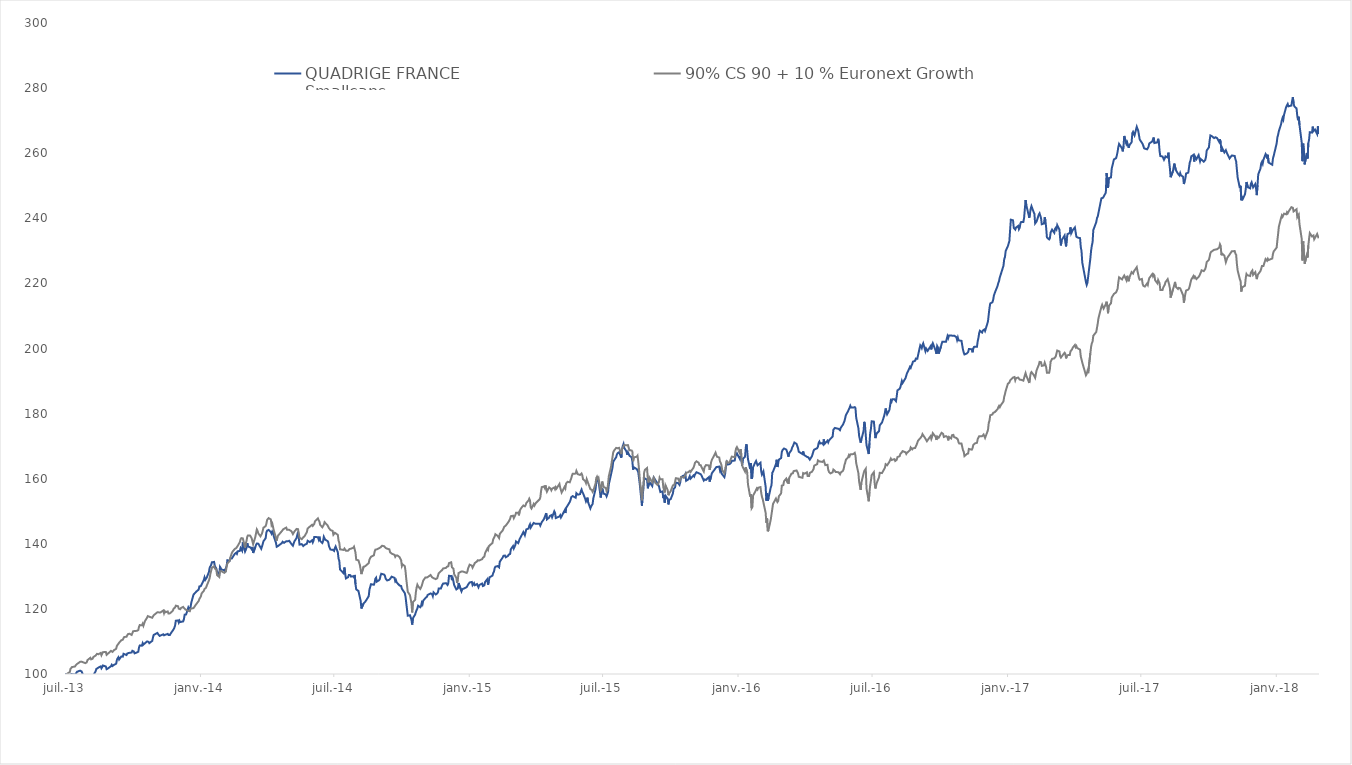
| Category |  QUADRIGE FRANCE
Smallcaps  |  90% CS 90 + 10 % Euronext Growth  |
|---|---|---|
| 2013-07-02 | 100 | 100 |
| 2013-07-03 | 100 | 99.55 |
| 2013-07-04 | 100 | 100 |
| 2013-07-05 | 100 | 100.09 |
| 2013-07-08 | 99.67 | 100.6 |
| 2013-07-09 | 99.74 | 101.59 |
| 2013-07-10 | 99.98 | 101.79 |
| 2013-07-11 | 100.09 | 102.13 |
| 2013-07-12 | 99.94 | 102.13 |
| 2013-07-15 | 99.78 | 102.3 |
| 2013-07-16 | 100.08 | 102.64 |
| 2013-07-17 | 100.35 | 102.73 |
| 2013-07-18 | 100.7 | 103.1 |
| 2013-07-19 | 100.81 | 103.21 |
| 2013-07-22 | 101.04 | 103.74 |
| 2013-07-23 | 101.19 | 103.82 |
| 2013-07-24 | 100.8 | 103.8 |
| 2013-07-25 | 100.83 | 103.89 |
| 2013-07-26 | 99.68 | 103.61 |
| 2013-07-29 | 99.56 | 103.34 |
| 2013-07-30 | 99.83 | 103.23 |
| 2013-07-31 | 99.26 | 103.58 |
| 2013-08-01 | 99.45 | 104.26 |
| 2013-08-02 | 99.39 | 104.38 |
| 2013-08-05 | 99.5 | 104.99 |
| 2013-08-06 | 99.4 | 104.5 |
| 2013-08-07 | 99.12 | 104.57 |
| 2013-08-08 | 98.98 | 104.7 |
| 2013-08-09 | 99.61 | 105.2 |
| 2013-08-12 | 100.8 | 105.64 |
| 2013-08-13 | 101.54 | 105.83 |
| 2013-08-14 | 101.75 | 106.19 |
| 2013-08-16 | 101.98 | 106.08 |
| 2013-08-19 | 102.33 | 106.47 |
| 2013-08-20 | 101.74 | 105.78 |
| 2013-08-21 | 102.09 | 106.28 |
| 2013-08-22 | 102.61 | 106.71 |
| 2013-08-23 | 102.81 | 107.01 |
| 2013-08-26 | 102.3 | 106.76 |
| 2013-08-27 | 101.48 | 105.89 |
| 2013-08-28 | 101.39 | 105.61 |
| 2013-08-29 | 101.72 | 106.29 |
| 2013-08-30 | 101.7 | 106.46 |
| 2013-09-02 | 102.41 | 107.11 |
| 2013-09-03 | 102.83 | 107.07 |
| 2013-09-04 | 102.46 | 106.79 |
| 2013-09-05 | 102.72 | 107.01 |
| 2013-09-06 | 102.81 | 107.32 |
| 2013-09-09 | 103.16 | 107.75 |
| 2013-09-10 | 104.36 | 108.67 |
| 2013-09-11 | 104.83 | 108.96 |
| 2013-09-12 | 105.15 | 109.26 |
| 2013-09-13 | 104.45 | 109.61 |
| 2013-09-16 | 105.38 | 110.38 |
| 2013-09-17 | 105.23 | 110.19 |
| 2013-09-18 | 105.34 | 110.53 |
| 2013-09-19 | 106.21 | 111.04 |
| 2013-09-20 | 105.95 | 111.38 |
| 2013-09-23 | 105.83 | 111.44 |
| 2013-09-24 | 106.29 | 111.86 |
| 2013-09-25 | 106.21 | 112.25 |
| 2013-09-26 | 106.46 | 112.3 |
| 2013-09-27 | 106.7 | 112.37 |
| 2013-09-30 | 106.61 | 112.01 |
| 2013-10-01 | 107.13 | 112.56 |
| 2013-10-02 | 107.23 | 113.12 |
| 2013-10-03 | 106.89 | 112.9 |
| 2013-10-04 | 106.34 | 113.22 |
| 2013-10-07 | 106.61 | 113.26 |
| 2013-10-08 | 106.82 | 113.34 |
| 2013-10-09 | 106.82 | 113.5 |
| 2013-10-10 | 108.14 | 114.48 |
| 2013-10-11 | 108.77 | 115.03 |
| 2013-10-14 | 108.69 | 114.96 |
| 2013-10-15 | 109.49 | 115.46 |
| 2013-10-16 | 109.03 | 114.82 |
| 2013-10-17 | 109.01 | 115.09 |
| 2013-10-18 | 109.44 | 116.22 |
| 2013-10-21 | 110 | 117.32 |
| 2013-10-22 | 110.22 | 117.79 |
| 2013-10-23 | 109.88 | 117.5 |
| 2013-10-24 | 109.48 | 117.6 |
| 2013-10-25 | 109.65 | 117.39 |
| 2013-10-28 | 110.18 | 117.28 |
| 2013-10-29 | 111.28 | 117.69 |
| 2013-10-30 | 112.02 | 118.06 |
| 2013-10-31 | 111.98 | 118.26 |
| 2013-11-04 | 112.61 | 118.97 |
| 2013-11-05 | 112.24 | 118.82 |
| 2013-11-06 | 111.99 | 118.93 |
| 2013-11-07 | 111.7 | 118.89 |
| 2013-11-08 | 111.74 | 118.89 |
| 2013-11-12 | 112.2 | 119.51 |
| 2013-11-13 | 111.89 | 118.67 |
| 2013-11-14 | 112.02 | 119.3 |
| 2013-11-15 | 112.09 | 118.97 |
| 2013-11-18 | 112.32 | 119.22 |
| 2013-11-19 | 112 | 118.59 |
| 2013-11-20 | 111.97 | 118.61 |
| 2013-11-21 | 112 | 118.63 |
| 2013-11-22 | 112.43 | 118.82 |
| 2013-11-25 | 113.4 | 119.45 |
| 2013-11-26 | 113.76 | 120.09 |
| 2013-11-27 | 114.2 | 120.35 |
| 2013-11-28 | 114.88 | 120.43 |
| 2013-11-29 | 116.37 | 120.99 |
| 2013-12-02 | 116.46 | 120.81 |
| 2013-12-03 | 115.8 | 120.07 |
| 2013-12-04 | 116.37 | 119.82 |
| 2013-12-05 | 115.96 | 119.9 |
| 2013-12-06 | 116.15 | 120.27 |
| 2013-12-09 | 116.16 | 120.6 |
| 2013-12-10 | 116.87 | 120.29 |
| 2013-12-11 | 118.23 | 120.39 |
| 2013-12-12 | 118.23 | 119.82 |
| 2013-12-13 | 118.3 | 119.62 |
| 2013-12-16 | 120.47 | 119.39 |
| 2013-12-17 | 120.06 | 119.12 |
| 2013-12-18 | 119.84 | 119.28 |
| 2013-12-19 | 120.56 | 120.05 |
| 2013-12-20 | 121.89 | 119.85 |
| 2013-12-23 | 124.37 | 120.24 |
| 2013-12-24 | 124.56 | 120.57 |
| 2013-12-27 | 125.37 | 121.54 |
| 2013-12-30 | 125.92 | 122.43 |
| 2013-12-31 | 126.91 | 123.04 |
| 2014-01-02 | 127 | 123.83 |
| 2014-01-03 | 127.26 | 124.75 |
| 2014-01-06 | 128.88 | 125.54 |
| 2014-01-07 | 129.67 | 126.12 |
| 2014-01-08 | 128.93 | 126.27 |
| 2014-01-09 | 129.09 | 126.49 |
| 2014-01-10 | 129.63 | 127.14 |
| 2014-01-13 | 131.38 | 128.76 |
| 2014-01-14 | 132.66 | 129.52 |
| 2014-01-15 | 132.93 | 130.83 |
| 2014-01-16 | 133.53 | 131.69 |
| 2014-01-17 | 134.32 | 132.68 |
| 2014-01-20 | 134.44 | 133.07 |
| 2014-01-21 | 133.15 | 132.39 |
| 2014-01-22 | 132.79 | 132.49 |
| 2014-01-23 | 132.38 | 132.09 |
| 2014-01-24 | 131.42 | 130.43 |
| 2014-01-27 | 130.61 | 129.78 |
| 2014-01-28 | 132.93 | 131.55 |
| 2014-01-29 | 132.57 | 131.52 |
| 2014-01-30 | 132.01 | 131.56 |
| 2014-01-31 | 131.77 | 131.35 |
| 2014-02-03 | 131.97 | 131.08 |
| 2014-02-04 | 131.28 | 130.87 |
| 2014-02-05 | 132.53 | 131.57 |
| 2014-02-06 | 133.2 | 133.04 |
| 2014-02-07 | 134.96 | 133.95 |
| 2014-02-10 | 134.79 | 134.66 |
| 2014-02-11 | 135.55 | 135.78 |
| 2014-02-12 | 135.58 | 135.93 |
| 2014-02-13 | 135.47 | 137.15 |
| 2014-02-14 | 135.67 | 137.57 |
| 2014-02-17 | 136.89 | 138.41 |
| 2014-02-18 | 137.09 | 138.36 |
| 2014-02-19 | 137.25 | 138.68 |
| 2014-02-20 | 136.92 | 138.61 |
| 2014-02-21 | 137.69 | 139.33 |
| 2014-02-24 | 137.83 | 140.55 |
| 2014-02-25 | 138.68 | 141.39 |
| 2014-02-26 | 138.42 | 141.74 |
| 2014-02-27 | 137.88 | 141.49 |
| 2014-02-28 | 140.44 | 141.66 |
| 2014-03-03 | 137.61 | 138.88 |
| 2014-03-04 | 138.09 | 140.12 |
| 2014-03-05 | 138.78 | 140.86 |
| 2014-03-06 | 140.2 | 142.16 |
| 2014-03-07 | 139.17 | 142.58 |
| 2014-03-10 | 138.93 | 142.51 |
| 2014-03-11 | 138.7 | 142.7 |
| 2014-03-12 | 138.37 | 141.69 |
| 2014-03-13 | 139.03 | 141.45 |
| 2014-03-14 | 137.19 | 139.88 |
| 2014-03-17 | 139.01 | 142.15 |
| 2014-03-18 | 139.71 | 143.27 |
| 2014-03-19 | 140.08 | 144.41 |
| 2014-03-20 | 140.14 | 143.98 |
| 2014-03-21 | 140.04 | 143.21 |
| 2014-03-24 | 138.89 | 142.3 |
| 2014-03-25 | 138.46 | 142.36 |
| 2014-03-26 | 139.12 | 143.17 |
| 2014-03-27 | 139 | 143.99 |
| 2014-03-28 | 140.77 | 144.95 |
| 2014-03-31 | 141.74 | 145.43 |
| 2014-04-01 | 143.45 | 146.17 |
| 2014-04-02 | 144.05 | 147.35 |
| 2014-04-03 | 143.95 | 147.54 |
| 2014-04-04 | 144.27 | 147.9 |
| 2014-04-07 | 143.59 | 147.49 |
| 2014-04-08 | 143.12 | 145.8 |
| 2014-04-09 | 143.8 | 146.23 |
| 2014-04-10 | 143.48 | 146.01 |
| 2014-04-11 | 142.36 | 144.18 |
| 2014-04-14 | 140.31 | 141.8 |
| 2014-04-15 | 139.09 | 140.96 |
| 2014-04-16 | 138.81 | 142.16 |
| 2014-04-17 | 139.35 | 142.56 |
| 2014-04-22 | 140.22 | 143.89 |
| 2014-04-23 | 140.63 | 143.79 |
| 2014-04-24 | 140.87 | 144.49 |
| 2014-04-25 | 140.3 | 144.28 |
| 2014-04-28 | 140.78 | 144.98 |
| 2014-04-29 | 140.83 | 144.33 |
| 2014-04-30 | 140.75 | 144.15 |
| 2014-05-02 | 140.93 | 144.29 |
| 2014-05-05 | 139.94 | 143.86 |
| 2014-05-06 | 139.7 | 143.48 |
| 2014-05-07 | 139.41 | 142.99 |
| 2014-05-09 | 140.72 | 143.76 |
| 2014-05-12 | 141.79 | 144.57 |
| 2014-05-13 | 142.78 | 144.66 |
| 2014-05-14 | 143.69 | 144.48 |
| 2014-05-15 | 141.7 | 143.12 |
| 2014-05-16 | 139.75 | 141.91 |
| 2014-05-19 | 139.9 | 141.41 |
| 2014-05-20 | 139.76 | 141.69 |
| 2014-05-21 | 139.31 | 141.97 |
| 2014-05-22 | 139.17 | 142.21 |
| 2014-05-23 | 139.7 | 142.39 |
| 2014-05-26 | 140.03 | 143.62 |
| 2014-05-27 | 140.93 | 144.69 |
| 2014-05-28 | 141.18 | 144.68 |
| 2014-05-30 | 140.51 | 145.28 |
| 2014-06-02 | 141.07 | 145.84 |
| 2014-06-03 | 140.43 | 145.51 |
| 2014-06-04 | 140.98 | 145.64 |
| 2014-06-05 | 142.07 | 146.12 |
| 2014-06-06 | 142.32 | 146.94 |
| 2014-06-10 | 142.04 | 147.8 |
| 2014-06-11 | 141.36 | 147.23 |
| 2014-06-12 | 142.19 | 146.86 |
| 2014-06-13 | 140.87 | 145.84 |
| 2014-06-16 | 140.25 | 145.07 |
| 2014-06-17 | 140.87 | 145.48 |
| 2014-06-18 | 142.16 | 145.9 |
| 2014-06-19 | 142.23 | 146.64 |
| 2014-06-20 | 141.23 | 146.37 |
| 2014-06-23 | 140.87 | 145.68 |
| 2014-06-24 | 140.52 | 145.48 |
| 2014-06-25 | 139.28 | 144.82 |
| 2014-06-26 | 138.72 | 144.65 |
| 2014-06-27 | 138.22 | 144.23 |
| 2014-06-30 | 138.18 | 143.96 |
| 2014-07-01 | 138.07 | 142.79 |
| 2014-07-02 | 137.81 | 142.81 |
| 2014-07-03 | 138.7 | 143.38 |
| 2014-07-04 | 139.18 | 143.67 |
| 2014-07-07 | 137.41 | 142.76 |
| 2014-07-08 | 135.44 | 140.98 |
| 2014-07-09 | 134.8 | 140.35 |
| 2014-07-10 | 132.11 | 138.3 |
| 2014-07-11 | 131.95 | 138.43 |
| 2014-07-15 | 130.92 | 138.11 |
| 2014-07-16 | 132.71 | 138.54 |
| 2014-07-17 | 130.82 | 138.35 |
| 2014-07-18 | 129.37 | 137.89 |
| 2014-07-21 | 129.75 | 137.9 |
| 2014-07-22 | 130.42 | 137.69 |
| 2014-07-23 | 130.53 | 138.41 |
| 2014-07-24 | 130.37 | 138.65 |
| 2014-07-25 | 129.92 | 138.51 |
| 2014-07-28 | 130.03 | 138.77 |
| 2014-07-29 | 129.7 | 139.12 |
| 2014-07-30 | 130.44 | 139.06 |
| 2014-07-31 | 127.62 | 137.29 |
| 2014-08-01 | 126 | 135.11 |
| 2014-08-04 | 125.51 | 134.92 |
| 2014-08-05 | 125.48 | 134.83 |
| 2014-08-06 | 123.47 | 133.46 |
| 2014-08-07 | 122.55 | 132.14 |
| 2014-08-08 | 120.12 | 130.69 |
| 2014-08-11 | 121.68 | 132.96 |
| 2014-08-12 | 121.89 | 132.99 |
| 2014-08-13 | 122.14 | 133.09 |
| 2014-08-14 | 122.45 | 133.24 |
| 2014-08-18 | 123.92 | 134.07 |
| 2014-08-19 | 125.96 | 135.19 |
| 2014-08-20 | 126.09 | 135.28 |
| 2014-08-21 | 127.58 | 136.01 |
| 2014-08-22 | 127.35 | 135.86 |
| 2014-08-25 | 127.42 | 136.48 |
| 2014-08-26 | 128.09 | 137.61 |
| 2014-08-27 | 129.28 | 138.19 |
| 2014-08-28 | 129.59 | 138.35 |
| 2014-08-29 | 128.39 | 138.3 |
| 2014-09-01 | 128.8 | 138.64 |
| 2014-09-02 | 129.16 | 138.77 |
| 2014-09-03 | 130.17 | 138.9 |
| 2014-09-04 | 130.8 | 139.04 |
| 2014-09-05 | 130.96 | 139.4 |
| 2014-09-08 | 130.53 | 139.25 |
| 2014-09-09 | 130.16 | 138.98 |
| 2014-09-10 | 129.28 | 138.71 |
| 2014-09-11 | 129.34 | 138.78 |
| 2014-09-12 | 128.74 | 138.49 |
| 2014-09-15 | 128.97 | 138.31 |
| 2014-09-16 | 128.74 | 137.41 |
| 2014-09-17 | 129.52 | 137.25 |
| 2014-09-18 | 129.9 | 137 |
| 2014-09-19 | 129.87 | 136.82 |
| 2014-09-22 | 129.54 | 136.61 |
| 2014-09-23 | 128.5 | 136.01 |
| 2014-09-24 | 128.82 | 136.37 |
| 2014-09-25 | 128.11 | 136.24 |
| 2014-09-26 | 128.02 | 136.42 |
| 2014-09-29 | 127.16 | 135.88 |
| 2014-09-30 | 127.36 | 135.77 |
| 2014-10-01 | 127.04 | 134.93 |
| 2014-10-02 | 126.18 | 133.17 |
| 2014-10-03 | 126.16 | 133.69 |
| 2014-10-06 | 124.83 | 133.12 |
| 2014-10-07 | 123.7 | 131.49 |
| 2014-10-08 | 121.69 | 129.12 |
| 2014-10-09 | 121.57 | 129.03 |
| 2014-10-10 | 117.91 | 125.25 |
| 2014-10-13 | 118.05 | 124.2 |
| 2014-10-14 | 117.97 | 123.92 |
| 2014-10-15 | 116.66 | 121.75 |
| 2014-10-16 | 115.18 | 118.92 |
| 2014-10-17 | 117.12 | 122.12 |
| 2014-10-20 | 118.28 | 122.76 |
| 2014-10-21 | 119.01 | 125.1 |
| 2014-10-22 | 119.63 | 126.55 |
| 2014-10-23 | 120.11 | 127.43 |
| 2014-10-24 | 120.98 | 126.96 |
| 2014-10-27 | 120.5 | 126.14 |
| 2014-10-28 | 120.86 | 126.15 |
| 2014-10-29 | 121.87 | 127.1 |
| 2014-10-30 | 121.43 | 127.27 |
| 2014-10-31 | 122.54 | 128.72 |
| 2014-11-03 | 123.33 | 129.67 |
| 2014-11-04 | 123.43 | 129.66 |
| 2014-11-05 | 123.74 | 129.64 |
| 2014-11-06 | 124.27 | 129.94 |
| 2014-11-07 | 124.16 | 129.93 |
| 2014-11-10 | 124.76 | 130.41 |
| 2014-11-12 | 124.53 | 129.72 |
| 2014-11-13 | 123.92 | 129.68 |
| 2014-11-14 | 125.07 | 129.45 |
| 2014-11-17 | 124.42 | 129.15 |
| 2014-11-18 | 124.47 | 129.19 |
| 2014-11-19 | 124.76 | 129.43 |
| 2014-11-20 | 125.15 | 129.65 |
| 2014-11-21 | 126.24 | 130.95 |
| 2014-11-24 | 126.27 | 131.59 |
| 2014-11-25 | 126.88 | 131.51 |
| 2014-11-26 | 127.4 | 132.03 |
| 2014-11-27 | 127.78 | 132.41 |
| 2014-11-28 | 127.86 | 132.5 |
| 2014-12-01 | 127.9 | 132.61 |
| 2014-12-02 | 127.72 | 132.93 |
| 2014-12-03 | 127.35 | 132.83 |
| 2014-12-04 | 127.87 | 133.1 |
| 2014-12-05 | 130.16 | 134.07 |
| 2014-12-08 | 130.12 | 134.32 |
| 2014-12-09 | 128.83 | 132.78 |
| 2014-12-10 | 129.47 | 132.73 |
| 2014-12-11 | 128.5 | 132.37 |
| 2014-12-12 | 127.31 | 130.68 |
| 2014-12-15 | 125.98 | 129.5 |
| 2014-12-16 | 125.98 | 128.01 |
| 2014-12-17 | 126.31 | 129.09 |
| 2014-12-18 | 127.93 | 131.01 |
| 2014-12-19 | 127.66 | 131.15 |
| 2014-12-22 | 125.41 | 131.52 |
| 2014-12-23 | 126.03 | 131.45 |
| 2014-12-24 | 126.24 | 131.47 |
| 2014-12-29 | 126.67 | 131.06 |
| 2014-12-30 | 126.95 | 131.49 |
| 2014-12-31 | 127.51 | 132.49 |
| 2015-01-02 | 128.12 | 133.6 |
| 2015-01-05 | 128.28 | 133.29 |
| 2015-01-06 | 127.3 | 132.68 |
| 2015-01-07 | 127.05 | 132.85 |
| 2015-01-08 | 127.91 | 133.57 |
| 2015-01-09 | 127.28 | 134.1 |
| 2015-01-12 | 127.63 | 134.57 |
| 2015-01-13 | 127.61 | 134.95 |
| 2015-01-14 | 126.65 | 134.87 |
| 2015-01-15 | 127.31 | 134.85 |
| 2015-01-16 | 127.4 | 134.68 |
| 2015-01-19 | 127.79 | 135.29 |
| 2015-01-20 | 127.03 | 135.73 |
| 2015-01-21 | 126.76 | 135.52 |
| 2015-01-22 | 127.25 | 136.06 |
| 2015-01-23 | 128.26 | 137.11 |
| 2015-01-26 | 129.13 | 138.53 |
| 2015-01-27 | 127.43 | 138.14 |
| 2015-01-28 | 128.41 | 139.21 |
| 2015-01-29 | 129.69 | 139.21 |
| 2015-01-30 | 129.65 | 139.67 |
| 2015-02-02 | 130.22 | 140.23 |
| 2015-02-03 | 130.98 | 141.4 |
| 2015-02-04 | 131.42 | 141.66 |
| 2015-02-05 | 132.47 | 142.25 |
| 2015-02-06 | 132.96 | 142.94 |
| 2015-02-09 | 133.16 | 142.45 |
| 2015-02-10 | 133.15 | 142.59 |
| 2015-02-11 | 132.76 | 141.76 |
| 2015-02-12 | 134.48 | 143.06 |
| 2015-02-13 | 134.59 | 143.26 |
| 2015-02-16 | 135.83 | 144.14 |
| 2015-02-17 | 136.31 | 144.34 |
| 2015-02-18 | 136.3 | 145.23 |
| 2015-02-19 | 136.39 | 145.31 |
| 2015-02-20 | 135.87 | 145.57 |
| 2015-02-23 | 136.23 | 146.49 |
| 2015-02-24 | 136.67 | 146.82 |
| 2015-02-25 | 136.6 | 147.03 |
| 2015-02-26 | 136.89 | 147.68 |
| 2015-02-27 | 138.32 | 148.49 |
| 2015-03-02 | 139.31 | 148.63 |
| 2015-03-03 | 138.57 | 147.89 |
| 2015-03-04 | 138.62 | 147.88 |
| 2015-03-05 | 139.57 | 148.78 |
| 2015-03-06 | 140.73 | 149.51 |
| 2015-03-09 | 140.19 | 149.54 |
| 2015-03-10 | 140.04 | 148.75 |
| 2015-03-11 | 141.5 | 150.14 |
| 2015-03-12 | 141.62 | 150.16 |
| 2015-03-13 | 142.32 | 150.96 |
| 2015-03-16 | 143.63 | 151.78 |
| 2015-03-17 | 143.41 | 151.59 |
| 2015-03-18 | 142.64 | 151.51 |
| 2015-03-19 | 142.85 | 151.84 |
| 2015-03-20 | 144.43 | 152.53 |
| 2015-03-23 | 144.68 | 153.34 |
| 2015-03-24 | 145.52 | 153.85 |
| 2015-03-25 | 145.99 | 153.33 |
| 2015-03-26 | 144.99 | 151.17 |
| 2015-03-27 | 145.39 | 150.82 |
| 2015-03-30 | 146.42 | 152.23 |
| 2015-03-31 | 146.15 | 151.73 |
| 2015-04-01 | 146.19 | 151.87 |
| 2015-04-02 | 146.27 | 152.55 |
| 2015-04-07 | 146.19 | 153.67 |
| 2015-04-08 | 145.61 | 154.19 |
| 2015-04-09 | 145.53 | 156.19 |
| 2015-04-10 | 146.65 | 157.42 |
| 2015-04-13 | 147.63 | 157.62 |
| 2015-04-14 | 147.66 | 157.17 |
| 2015-04-15 | 148.82 | 157.96 |
| 2015-04-16 | 149.41 | 157.94 |
| 2015-04-17 | 147.49 | 156.04 |
| 2015-04-20 | 148.05 | 157.33 |
| 2015-04-21 | 148.57 | 157.44 |
| 2015-04-22 | 148.74 | 156.94 |
| 2015-04-23 | 148.79 | 156.44 |
| 2015-04-24 | 148.14 | 156.93 |
| 2015-04-27 | 150 | 157.31 |
| 2015-04-28 | 149.54 | 156.79 |
| 2015-04-29 | 147.91 | 157.4 |
| 2015-04-30 | 147.85 | 156.98 |
| 2015-05-04 | 148.41 | 158.39 |
| 2015-05-05 | 148.77 | 157.27 |
| 2015-05-06 | 148.07 | 156.5 |
| 2015-05-07 | 147.9 | 155.75 |
| 2015-05-11 | 150.26 | 157.5 |
| 2015-05-12 | 149.45 | 157.03 |
| 2015-05-13 | 151.01 | 158.51 |
| 2015-05-15 | 151.72 | 159.05 |
| 2015-05-18 | 152.85 | 158.89 |
| 2015-05-19 | 153.46 | 159.53 |
| 2015-05-20 | 154.31 | 160.12 |
| 2015-05-21 | 154.6 | 160.95 |
| 2015-05-22 | 154.65 | 161.55 |
| 2015-05-26 | 154.15 | 161.56 |
| 2015-05-27 | 155.57 | 162.4 |
| 2015-05-28 | 155.53 | 161.88 |
| 2015-05-29 | 155.09 | 161.38 |
| 2015-06-01 | 155.27 | 161.16 |
| 2015-06-02 | 156.13 | 161.3 |
| 2015-06-03 | 156.66 | 161.6 |
| 2015-06-04 | 155.93 | 161.07 |
| 2015-06-05 | 155.56 | 159.87 |
| 2015-06-08 | 153.79 | 159.23 |
| 2015-06-09 | 153.03 | 158.68 |
| 2015-06-10 | 153.57 | 159.86 |
| 2015-06-11 | 154.18 | 159.96 |
| 2015-06-12 | 152.71 | 158.62 |
| 2015-06-15 | 150.87 | 156.79 |
| 2015-06-16 | 151.5 | 156.76 |
| 2015-06-17 | 151.79 | 156.55 |
| 2015-06-18 | 152.22 | 155.99 |
| 2015-06-19 | 153.97 | 156.36 |
| 2015-06-22 | 156.78 | 158.46 |
| 2015-06-23 | 158.72 | 160.2 |
| 2015-06-24 | 159.68 | 160.64 |
| 2015-06-25 | 159.53 | 160.02 |
| 2015-06-26 | 159.43 | 160.33 |
| 2015-06-29 | 154.21 | 156.38 |
| 2015-06-30 | 153.98 | 156.7 |
| 2015-07-01 | 157 | 159.13 |
| 2015-07-02 | 156.35 | 158.37 |
| 2015-07-03 | 155.42 | 157.47 |
| 2015-07-06 | 155.15 | 157.13 |
| 2015-07-07 | 154.58 | 156.19 |
| 2015-07-08 | 154.46 | 156.59 |
| 2015-07-09 | 155.88 | 158.43 |
| 2015-07-10 | 158.22 | 160.75 |
| 2015-07-13 | 161.3 | 163.64 |
| 2015-07-15 | 163.35 | 166.58 |
| 2015-07-16 | 165.22 | 168.09 |
| 2015-07-17 | 165.23 | 168.59 |
| 2015-07-20 | 166.59 | 169.46 |
| 2015-07-21 | 167.44 | 169.46 |
| 2015-07-22 | 167.82 | 169.36 |
| 2015-07-23 | 167.69 | 169.17 |
| 2015-07-24 | 168.13 | 169.49 |
| 2015-07-27 | 166.46 | 167.57 |
| 2015-07-28 | 169.05 | 169.14 |
| 2015-07-29 | 170.03 | 169.56 |
| 2015-07-30 | 170.66 | 169.86 |
| 2015-07-31 | 169.45 | 170.36 |
| 2015-08-03 | 168.4 | 170.25 |
| 2015-08-04 | 167.36 | 169.99 |
| 2015-08-05 | 168.11 | 170.34 |
| 2015-08-06 | 167.84 | 170.18 |
| 2015-08-07 | 167.07 | 168.74 |
| 2015-08-10 | 166.57 | 168.68 |
| 2015-08-11 | 165.34 | 168.36 |
| 2015-08-12 | 162.79 | 165.36 |
| 2015-08-13 | 163.51 | 166.57 |
| 2015-08-14 | 163.34 | 166.75 |
| 2015-08-17 | 162.96 | 166.74 |
| 2015-08-18 | 162.68 | 167.06 |
| 2015-08-19 | 162.02 | 165.32 |
| 2015-08-20 | 160.33 | 163.04 |
| 2015-08-21 | 158.48 | 160.14 |
| 2015-08-24 | 151.71 | 153.38 |
| 2015-08-25 | 154.92 | 157.56 |
| 2015-08-26 | 156.86 | 158.01 |
| 2015-08-27 | 160.22 | 161.87 |
| 2015-08-28 | 160.04 | 162.72 |
| 2015-08-31 | 159.65 | 163.28 |
| 2015-09-01 | 157.05 | 159.68 |
| 2015-09-02 | 156.96 | 158.85 |
| 2015-09-03 | 159.02 | 160.43 |
| 2015-09-07 | 157.74 | 158.89 |
| 2015-09-08 | 159.28 | 159.67 |
| 2015-09-09 | 160.38 | 160.31 |
| 2015-09-10 | 160.04 | 159.67 |
| 2015-09-11 | 159.65 | 158.81 |
| 2015-09-14 | 158.62 | 158.11 |
| 2015-09-15 | 158.24 | 158.44 |
| 2015-09-16 | 157.8 | 158.93 |
| 2015-09-17 | 157.5 | 160.27 |
| 2015-09-18 | 155.91 | 159.81 |
| 2015-09-21 | 156.09 | 159.81 |
| 2015-09-22 | 154.03 | 157.4 |
| 2015-09-23 | 154.92 | 157.4 |
| 2015-09-24 | 152.65 | 155.76 |
| 2015-09-25 | 154.78 | 157.98 |
| 2015-09-28 | 153.86 | 156.49 |
| 2015-09-29 | 152.1 | 154.92 |
| 2015-09-30 | 153.52 | 155.53 |
| 2015-10-01 | 153.28 | 155.78 |
| 2015-10-02 | 153.71 | 156.13 |
| 2015-10-05 | 155.42 | 157.92 |
| 2015-10-06 | 156.89 | 158 |
| 2015-10-07 | 157.19 | 158.14 |
| 2015-10-08 | 157.31 | 158.98 |
| 2015-10-09 | 158.75 | 160.15 |
| 2015-10-12 | 158.7 | 160.05 |
| 2015-10-13 | 158.45 | 159.56 |
| 2015-10-14 | 158.09 | 159.11 |
| 2015-10-15 | 158.81 | 159.81 |
| 2015-10-16 | 160.45 | 160.45 |
| 2015-10-19 | 160.89 | 160.4 |
| 2015-10-20 | 160.5 | 160.24 |
| 2015-10-21 | 160.79 | 160.67 |
| 2015-10-22 | 161.44 | 161.3 |
| 2015-10-23 | 159.35 | 161.78 |
| 2015-10-26 | 159.77 | 162.02 |
| 2015-10-27 | 159.52 | 161.8 |
| 2015-10-28 | 160.8 | 162.4 |
| 2015-10-29 | 160.02 | 162.06 |
| 2015-10-30 | 160.19 | 162.28 |
| 2015-11-02 | 161 | 163.37 |
| 2015-11-03 | 160.69 | 164 |
| 2015-11-04 | 161.27 | 164.84 |
| 2015-11-05 | 161.12 | 164.97 |
| 2015-11-06 | 161.98 | 165.35 |
| 2015-11-09 | 161.71 | 164.91 |
| 2015-11-10 | 161.53 | 164.26 |
| 2015-11-12 | 161.35 | 164.11 |
| 2015-11-13 | 160.93 | 163.52 |
| 2015-11-16 | 159.45 | 162.22 |
| 2015-11-17 | 159.78 | 163.5 |
| 2015-11-18 | 159.85 | 163.47 |
| 2015-11-19 | 159.64 | 164.19 |
| 2015-11-20 | 159.52 | 164.21 |
| 2015-11-23 | 160.52 | 164.07 |
| 2015-11-24 | 159.11 | 162.72 |
| 2015-11-25 | 159.15 | 163.69 |
| 2015-11-26 | 160.77 | 165.1 |
| 2015-11-27 | 161.71 | 165.8 |
| 2015-11-30 | 162.59 | 167.11 |
| 2015-12-01 | 162.91 | 167.54 |
| 2015-12-02 | 162.87 | 167.99 |
| 2015-12-03 | 163.56 | 167.27 |
| 2015-12-04 | 163.52 | 166.75 |
| 2015-12-07 | 163.73 | 166.52 |
| 2015-12-08 | 162.56 | 165.26 |
| 2015-12-09 | 163.08 | 164.85 |
| 2015-12-10 | 161.63 | 164.19 |
| 2015-12-11 | 161.74 | 162.68 |
| 2015-12-14 | 160.48 | 161.63 |
| 2015-12-15 | 161.55 | 162.61 |
| 2015-12-16 | 163.54 | 164.01 |
| 2015-12-17 | 164.88 | 165.54 |
| 2015-12-18 | 164.33 | 164.95 |
| 2015-12-21 | 164.49 | 165.02 |
| 2015-12-22 | 164.69 | 164.72 |
| 2015-12-23 | 164.91 | 166.21 |
| 2015-12-24 | 165.48 | 166.78 |
| 2015-12-28 | 165.57 | 166.63 |
| 2015-12-29 | 166.91 | 168.39 |
| 2015-12-30 | 167.44 | 169.35 |
| 2015-12-31 | 167.8 | 169.72 |
| 2016-01-04 | 166.03 | 167.82 |
| 2016-01-05 | 167.05 | 169.11 |
| 2016-01-06 | 166.14 | 167.29 |
| 2016-01-07 | 164.03 | 164.17 |
| 2016-01-08 | 166.04 | 163.58 |
| 2016-01-11 | 166.74 | 162.23 |
| 2016-01-12 | 169.6 | 163.54 |
| 2016-01-13 | 170.58 | 163.76 |
| 2016-01-14 | 168.32 | 161.88 |
| 2016-01-15 | 166.05 | 158.27 |
| 2016-01-18 | 162.93 | 154.51 |
| 2016-01-19 | 164.78 | 155.25 |
| 2016-01-20 | 159.99 | 150.93 |
| 2016-01-21 | 160.65 | 151.31 |
| 2016-01-22 | 163.58 | 154.82 |
| 2016-01-25 | 165.02 | 156.07 |
| 2016-01-26 | 165.44 | 156.15 |
| 2016-01-27 | 165.3 | 157.02 |
| 2016-01-28 | 164.13 | 156.68 |
| 2016-01-29 | 164.03 | 157.23 |
| 2016-02-01 | 164.92 | 157.42 |
| 2016-02-02 | 162.25 | 155.65 |
| 2016-02-03 | 161.26 | 154.42 |
| 2016-02-04 | 161.69 | 153.75 |
| 2016-02-05 | 162.2 | 153.58 |
| 2016-02-08 | 157.57 | 149.53 |
| 2016-02-09 | 153.25 | 146.45 |
| 2016-02-10 | 155.57 | 147.8 |
| 2016-02-11 | 153.21 | 143.86 |
| 2016-02-12 | 154.17 | 144.32 |
| 2016-02-15 | 157.38 | 147.5 |
| 2016-02-16 | 157.99 | 147.33 |
| 2016-02-17 | 161.8 | 150.65 |
| 2016-02-18 | 162.17 | 152.24 |
| 2016-02-19 | 162.2 | 152.37 |
| 2016-02-22 | 164.49 | 153.92 |
| 2016-02-23 | 165.83 | 154.02 |
| 2016-02-24 | 163.6 | 152.83 |
| 2016-02-25 | 164.69 | 153.15 |
| 2016-02-26 | 165.87 | 154.61 |
| 2016-02-29 | 166.33 | 155.48 |
| 2016-03-01 | 168.27 | 157.88 |
| 2016-03-02 | 168.8 | 158.02 |
| 2016-03-03 | 168.97 | 158.01 |
| 2016-03-04 | 169.29 | 159.22 |
| 2016-03-07 | 168.95 | 160.02 |
| 2016-03-08 | 168.38 | 159.21 |
| 2016-03-09 | 167.55 | 159.52 |
| 2016-03-10 | 166.75 | 158.42 |
| 2016-03-11 | 167.82 | 160.25 |
| 2016-03-14 | 168.78 | 161.52 |
| 2016-03-15 | 169.59 | 161.24 |
| 2016-03-16 | 169.97 | 161.67 |
| 2016-03-17 | 169.72 | 162.33 |
| 2016-03-18 | 171.11 | 162.62 |
| 2016-03-21 | 170.69 | 162.53 |
| 2016-03-22 | 170.77 | 162.25 |
| 2016-03-23 | 169.38 | 161.66 |
| 2016-03-24 | 168.28 | 160.58 |
| 2016-03-29 | 167.58 | 160.29 |
| 2016-03-30 | 168.38 | 161.74 |
| 2016-03-31 | 167.35 | 161.64 |
| 2016-04-01 | 167.14 | 161.55 |
| 2016-04-04 | 166.72 | 161.96 |
| 2016-04-05 | 166.67 | 160.82 |
| 2016-04-06 | 166.57 | 160.82 |
| 2016-04-07 | 166.17 | 160.8 |
| 2016-04-08 | 165.86 | 161.81 |
| 2016-04-11 | 166.96 | 162.15 |
| 2016-04-12 | 167.18 | 162.02 |
| 2016-04-13 | 168.48 | 162.92 |
| 2016-04-14 | 168.95 | 164.02 |
| 2016-04-15 | 169.15 | 164.19 |
| 2016-04-18 | 169.36 | 164.48 |
| 2016-04-19 | 169.82 | 165.62 |
| 2016-04-20 | 171 | 165.79 |
| 2016-04-21 | 171.4 | 165.31 |
| 2016-04-22 | 170.83 | 165.05 |
| 2016-04-25 | 170.91 | 165.16 |
| 2016-04-26 | 170.6 | 165.19 |
| 2016-04-27 | 172.07 | 165.6 |
| 2016-04-28 | 170.69 | 165.47 |
| 2016-04-29 | 170.71 | 164.18 |
| 2016-05-02 | 171.68 | 164.28 |
| 2016-05-03 | 171.15 | 162.74 |
| 2016-05-04 | 171.73 | 162.09 |
| 2016-05-06 | 172.25 | 161.63 |
| 2016-05-09 | 172.97 | 161.97 |
| 2016-05-10 | 175.03 | 162.81 |
| 2016-05-11 | 175.22 | 162.8 |
| 2016-05-12 | 175.6 | 162.4 |
| 2016-05-13 | 175.86 | 162.07 |
| 2016-05-17 | 175.31 | 161.99 |
| 2016-05-18 | 175.1 | 161.93 |
| 2016-05-19 | 174.91 | 161.36 |
| 2016-05-20 | 175.64 | 161.89 |
| 2016-05-23 | 176.61 | 162.41 |
| 2016-05-24 | 176.77 | 163.02 |
| 2016-05-25 | 177.68 | 164.21 |
| 2016-05-26 | 178.59 | 164.85 |
| 2016-05-27 | 179.53 | 165.82 |
| 2016-05-30 | 180.78 | 166.57 |
| 2016-05-31 | 181.31 | 167.23 |
| 2016-06-01 | 181.79 | 166.88 |
| 2016-06-02 | 182.4 | 167.47 |
| 2016-06-03 | 181.84 | 167.55 |
| 2016-06-06 | 181.84 | 167.56 |
| 2016-06-07 | 181.84 | 167.85 |
| 2016-06-08 | 182 | 167.94 |
| 2016-06-09 | 181.67 | 167.04 |
| 2016-06-10 | 178.73 | 164.77 |
| 2016-06-13 | 175.49 | 161.69 |
| 2016-06-14 | 173.12 | 159.03 |
| 2016-06-15 | 173.3 | 159.26 |
| 2016-06-16 | 171.09 | 156.57 |
| 2016-06-17 | 172.02 | 158.78 |
| 2016-06-20 | 174.65 | 161.6 |
| 2016-06-21 | 177.47 | 162.38 |
| 2016-06-22 | 176.26 | 162.28 |
| 2016-06-23 | 176.54 | 163.05 |
| 2016-06-24 | 170.3 | 156.96 |
| 2016-06-27 | 167.57 | 153.06 |
| 2016-06-28 | 170.86 | 155.82 |
| 2016-06-29 | 173.98 | 157.98 |
| 2016-06-30 | 175.34 | 159.43 |
| 2016-07-01 | 177.63 | 161.11 |
| 2016-07-04 | 177.55 | 162 |
| 2016-07-05 | 175.18 | 158.74 |
| 2016-07-06 | 172.47 | 157 |
| 2016-07-07 | 173.32 | 157.91 |
| 2016-07-08 | 173.95 | 158.75 |
| 2016-07-11 | 174.61 | 160.45 |
| 2016-07-12 | 176.39 | 161.82 |
| 2016-07-13 | 176.63 | 161.93 |
| 2016-07-15 | 177.26 | 161.73 |
| 2016-07-18 | 179.31 | 162.94 |
| 2016-07-19 | 180.32 | 163.39 |
| 2016-07-20 | 181.57 | 164.46 |
| 2016-07-21 | 181.4 | 164.44 |
| 2016-07-22 | 179.79 | 164.12 |
| 2016-07-25 | 181.04 | 165.17 |
| 2016-07-26 | 182.41 | 164.97 |
| 2016-07-27 | 183.98 | 166.19 |
| 2016-07-28 | 183.66 | 165.75 |
| 2016-07-29 | 184.42 | 165.54 |
| 2016-08-01 | 184.42 | 166.01 |
| 2016-08-02 | 184.32 | 165.45 |
| 2016-08-03 | 183.83 | 165.59 |
| 2016-08-04 | 185.25 | 165.79 |
| 2016-08-05 | 187.13 | 166.64 |
| 2016-08-08 | 187.63 | 166.91 |
| 2016-08-09 | 188.11 | 167.64 |
| 2016-08-10 | 188.37 | 167.65 |
| 2016-08-11 | 190.02 | 168.12 |
| 2016-08-12 | 189.4 | 168.48 |
| 2016-08-16 | 190.91 | 168.12 |
| 2016-08-17 | 190.69 | 167.62 |
| 2016-08-18 | 192.43 | 167.96 |
| 2016-08-19 | 192.82 | 167.84 |
| 2016-08-22 | 194.36 | 168.76 |
| 2016-08-23 | 194.04 | 169.59 |
| 2016-08-24 | 194.71 | 169.67 |
| 2016-08-25 | 195.16 | 169.01 |
| 2016-08-26 | 195.95 | 169.33 |
| 2016-08-29 | 196.23 | 169.44 |
| 2016-08-30 | 196.9 | 169.92 |
| 2016-08-31 | 197.02 | 170.41 |
| 2016-09-01 | 196.84 | 170.58 |
| 2016-09-02 | 197.95 | 171.69 |
| 2016-09-05 | 200.96 | 172.44 |
| 2016-09-06 | 200.6 | 172.58 |
| 2016-09-07 | 200.13 | 173.06 |
| 2016-09-08 | 201.02 | 173.7 |
| 2016-09-09 | 201.58 | 173.69 |
| 2016-09-12 | 199.17 | 172.31 |
| 2016-09-13 | 199.99 | 172.21 |
| 2016-09-14 | 199.71 | 171.51 |
| 2016-09-15 | 199.27 | 171.81 |
| 2016-09-16 | 199.43 | 172.15 |
| 2016-09-19 | 200.7 | 173.07 |
| 2016-09-20 | 199.71 | 172.22 |
| 2016-09-21 | 201.13 | 172.87 |
| 2016-09-22 | 201.64 | 173.99 |
| 2016-09-23 | 201.34 | 173.91 |
| 2016-09-26 | 199.26 | 172.82 |
| 2016-09-27 | 198.34 | 171.9 |
| 2016-09-28 | 200.71 | 172.96 |
| 2016-09-29 | 200.24 | 173.19 |
| 2016-09-30 | 198.43 | 172.58 |
| 2016-10-03 | 200.55 | 173.76 |
| 2016-10-04 | 201.43 | 174.1 |
| 2016-10-05 | 202.08 | 174.08 |
| 2016-10-06 | 201.85 | 173.79 |
| 2016-10-07 | 202.08 | 172.82 |
| 2016-10-10 | 202.06 | 173.08 |
| 2016-10-11 | 203 | 172.92 |
| 2016-10-12 | 203.83 | 172.75 |
| 2016-10-13 | 203.24 | 171.78 |
| 2016-10-14 | 204 | 172.83 |
| 2016-10-17 | 204 | 172.38 |
| 2016-10-18 | 204.14 | 173.34 |
| 2016-10-19 | 203.9 | 173.56 |
| 2016-10-20 | 204.01 | 173.46 |
| 2016-10-21 | 203.95 | 172.79 |
| 2016-10-24 | 203.49 | 172.52 |
| 2016-10-25 | 202.6 | 172.32 |
| 2016-10-26 | 203.36 | 172.07 |
| 2016-10-27 | 202.51 | 171.16 |
| 2016-10-28 | 202.21 | 170.79 |
| 2016-10-31 | 202.35 | 170.79 |
| 2016-11-02 | 199.65 | 168.76 |
| 2016-11-03 | 198.75 | 168.34 |
| 2016-11-04 | 198.17 | 166.94 |
| 2016-11-07 | 198.45 | 167.57 |
| 2016-11-08 | 198.62 | 167.41 |
| 2016-11-09 | 198.87 | 167.73 |
| 2016-11-10 | 199.83 | 169.14 |
| 2016-11-14 | 199.79 | 168.92 |
| 2016-11-15 | 198.83 | 169.39 |
| 2016-11-16 | 200.02 | 170.35 |
| 2016-11-17 | 200.5 | 170.46 |
| 2016-11-18 | 200.72 | 170.82 |
| 2016-11-21 | 200.55 | 171.03 |
| 2016-11-22 | 202.23 | 172.15 |
| 2016-11-23 | 203.25 | 172.65 |
| 2016-11-24 | 204.72 | 173.07 |
| 2016-11-25 | 205.45 | 172.94 |
| 2016-11-28 | 204.9 | 173.07 |
| 2016-11-29 | 205.52 | 173 |
| 2016-11-30 | 205.76 | 173.57 |
| 2016-12-01 | 205.85 | 173.06 |
| 2016-12-02 | 205.38 | 172.54 |
| 2016-12-05 | 207.58 | 174.33 |
| 2016-12-06 | 208.42 | 175.02 |
| 2016-12-07 | 210.49 | 177.15 |
| 2016-12-08 | 212.41 | 177.82 |
| 2016-12-09 | 213.83 | 179.48 |
| 2016-12-12 | 214.2 | 179.74 |
| 2016-12-13 | 214.97 | 180.24 |
| 2016-12-14 | 216.26 | 180.07 |
| 2016-12-15 | 216.96 | 180.42 |
| 2016-12-16 | 217.23 | 180.46 |
| 2016-12-19 | 219.25 | 181.34 |
| 2016-12-20 | 220.12 | 181.97 |
| 2016-12-21 | 220.73 | 182.37 |
| 2016-12-22 | 221.86 | 181.98 |
| 2016-12-23 | 222.54 | 182.46 |
| 2016-12-27 | 225.42 | 183.75 |
| 2016-12-28 | 227.44 | 185.19 |
| 2016-12-29 | 228.09 | 185.98 |
| 2016-12-30 | 229.95 | 186.98 |
| 2017-01-02 | 231.47 | 189.19 |
| 2017-01-03 | 231.43 | 189.32 |
| 2017-01-04 | 232.98 | 189.53 |
| 2017-01-05 | 236.37 | 190.18 |
| 2017-01-06 | 239.58 | 190.28 |
| 2017-01-09 | 239.36 | 191.08 |
| 2017-01-10 | 237.06 | 191.29 |
| 2017-01-11 | 236.99 | 191.23 |
| 2017-01-12 | 236.54 | 190.25 |
| 2017-01-13 | 237.16 | 190.89 |
| 2017-01-16 | 237.66 | 191.07 |
| 2017-01-17 | 236.63 | 190.87 |
| 2017-01-18 | 237.08 | 190.45 |
| 2017-01-19 | 238.44 | 190.64 |
| 2017-01-20 | 238.89 | 190.38 |
| 2017-01-23 | 238.88 | 190.12 |
| 2017-01-24 | 240.13 | 190.36 |
| 2017-01-25 | 242.81 | 191.73 |
| 2017-01-26 | 245.62 | 192.44 |
| 2017-01-27 | 244.07 | 191.66 |
| 2017-01-30 | 241.19 | 190.01 |
| 2017-01-31 | 240.16 | 189.39 |
| 2017-02-01 | 241.49 | 191.07 |
| 2017-02-02 | 242.99 | 192.39 |
| 2017-02-03 | 243.74 | 192.76 |
| 2017-02-06 | 241.89 | 191.89 |
| 2017-02-07 | 241.36 | 192.05 |
| 2017-02-08 | 238.44 | 190.99 |
| 2017-02-09 | 238.26 | 191.01 |
| 2017-02-10 | 239.04 | 193.32 |
| 2017-02-13 | 241.15 | 195 |
| 2017-02-14 | 241.53 | 195.88 |
| 2017-02-15 | 240.83 | 196.11 |
| 2017-02-16 | 240.08 | 195.78 |
| 2017-02-17 | 238.17 | 194.67 |
| 2017-02-20 | 238.41 | 194.82 |
| 2017-02-21 | 240.32 | 195.64 |
| 2017-02-22 | 239.31 | 195.43 |
| 2017-02-23 | 236.99 | 194.25 |
| 2017-02-24 | 234.15 | 192.52 |
| 2017-02-27 | 233.5 | 192.54 |
| 2017-02-28 | 233.83 | 193.62 |
| 2017-03-01 | 235.6 | 195.95 |
| 2017-03-02 | 235.79 | 196.32 |
| 2017-03-03 | 236.52 | 196.82 |
| 2017-03-06 | 235.55 | 196.96 |
| 2017-03-07 | 236.72 | 196.7 |
| 2017-03-08 | 237.08 | 197.55 |
| 2017-03-09 | 236.65 | 197.58 |
| 2017-03-10 | 237.92 | 199.38 |
| 2017-03-13 | 236.54 | 199.09 |
| 2017-03-14 | 233.69 | 197.61 |
| 2017-03-15 | 231.67 | 197.21 |
| 2017-03-16 | 233.28 | 197.25 |
| 2017-03-17 | 233.62 | 197.83 |
| 2017-03-20 | 234.72 | 198.7 |
| 2017-03-21 | 232.61 | 198.39 |
| 2017-03-22 | 231.37 | 196.97 |
| 2017-03-23 | 233.78 | 197.61 |
| 2017-03-24 | 235.16 | 197.95 |
| 2017-03-27 | 235.49 | 198.01 |
| 2017-03-28 | 237.22 | 199.13 |
| 2017-03-29 | 235.39 | 199.05 |
| 2017-03-30 | 235.51 | 199.69 |
| 2017-03-31 | 236.36 | 200.23 |
| 2017-04-03 | 237.2 | 201.08 |
| 2017-04-04 | 235.73 | 200.42 |
| 2017-04-05 | 234.34 | 200.76 |
| 2017-04-06 | 234.61 | 200.18 |
| 2017-04-07 | 234.06 | 200.02 |
| 2017-04-10 | 233.91 | 199.65 |
| 2017-04-11 | 231.1 | 197.51 |
| 2017-04-12 | 229.95 | 197.26 |
| 2017-04-13 | 226.43 | 195.69 |
| 2017-04-18 | 220.41 | 191.78 |
| 2017-04-19 | 219.52 | 192.18 |
| 2017-04-20 | 220.16 | 193.05 |
| 2017-04-21 | 220.14 | 192.43 |
| 2017-04-24 | 227.69 | 198.59 |
| 2017-04-25 | 230.08 | 200.51 |
| 2017-04-26 | 231.61 | 201.62 |
| 2017-04-27 | 232.63 | 202.1 |
| 2017-04-28 | 236.38 | 203.93 |
| 2017-05-02 | 238.82 | 205.08 |
| 2017-05-03 | 240.06 | 205.33 |
| 2017-05-04 | 240.51 | 207.66 |
| 2017-05-05 | 240.8 | 209.31 |
| 2017-05-09 | 246.14 | 212.83 |
| 2017-05-10 | 246.07 | 213.43 |
| 2017-05-11 | 246.28 | 212.8 |
| 2017-05-12 | 246.62 | 212.25 |
| 2017-05-15 | 247.9 | 213.62 |
| 2017-05-16 | 253.89 | 214.38 |
| 2017-05-17 | 251.77 | 213.02 |
| 2017-05-18 | 249.31 | 210.83 |
| 2017-05-19 | 252.34 | 213.1 |
| 2017-05-22 | 252.56 | 213.9 |
| 2017-05-23 | 255.28 | 215.65 |
| 2017-05-24 | 255.39 | 215.59 |
| 2017-05-26 | 258.08 | 216.76 |
| 2017-05-29 | 258.48 | 217.26 |
| 2017-05-30 | 259.36 | 217.36 |
| 2017-05-31 | 260.48 | 218.37 |
| 2017-06-01 | 261.87 | 220.42 |
| 2017-06-02 | 262.85 | 221.87 |
| 2017-06-06 | 261.46 | 221.22 |
| 2017-06-07 | 260.56 | 221.69 |
| 2017-06-08 | 262.14 | 221.64 |
| 2017-06-09 | 265.3 | 222.43 |
| 2017-06-12 | 262.84 | 220.96 |
| 2017-06-13 | 263.34 | 222.33 |
| 2017-06-14 | 263.44 | 222.3 |
| 2017-06-15 | 261.65 | 220.67 |
| 2017-06-16 | 262.5 | 221.82 |
| 2017-06-19 | 263.33 | 223.48 |
| 2017-06-20 | 266.17 | 223.23 |
| 2017-06-21 | 266.57 | 223.01 |
| 2017-06-22 | 266.42 | 223.65 |
| 2017-06-23 | 265.49 | 223.35 |
| 2017-06-26 | 268.12 | 224.99 |
| 2017-06-27 | 267.49 | 223.77 |
| 2017-06-28 | 266.91 | 223.72 |
| 2017-06-29 | 266.86 | 221.67 |
| 2017-06-30 | 264.23 | 221.15 |
| 2017-07-03 | 263.21 | 221.37 |
| 2017-07-04 | 262.8 | 219.85 |
| 2017-07-05 | 262.23 | 219.26 |
| 2017-07-06 | 261.5 | 218.97 |
| 2017-07-07 | 261.67 | 219.04 |
| 2017-07-10 | 261.19 | 219.97 |
| 2017-07-11 | 261.52 | 219.54 |
| 2017-07-12 | 261.96 | 220.78 |
| 2017-07-13 | 262.99 | 221.61 |
| 2017-07-17 | 263.61 | 222.85 |
| 2017-07-18 | 263.82 | 222.21 |
| 2017-07-19 | 264.82 | 222.74 |
| 2017-07-20 | 263.11 | 222.41 |
| 2017-07-21 | 263.4 | 220.96 |
| 2017-07-24 | 263.33 | 220.05 |
| 2017-07-25 | 264.43 | 221.06 |
| 2017-07-26 | 263.45 | 220.83 |
| 2017-07-27 | 260.66 | 220.05 |
| 2017-07-28 | 259.11 | 217.98 |
| 2017-07-31 | 259 | 217.98 |
| 2017-08-01 | 258.82 | 218.78 |
| 2017-08-02 | 257.98 | 218.99 |
| 2017-08-03 | 258.42 | 219.58 |
| 2017-08-04 | 259.04 | 220.38 |
| 2017-08-07 | 258.7 | 221.31 |
| 2017-08-08 | 260.17 | 221.31 |
| 2017-08-09 | 257.41 | 219.64 |
| 2017-08-10 | 255.39 | 218.5 |
| 2017-08-11 | 252.63 | 215.64 |
| 2017-08-14 | 254.33 | 218.01 |
| 2017-08-16 | 256.81 | 219.54 |
| 2017-08-17 | 256.59 | 220.46 |
| 2017-08-18 | 254.85 | 218.94 |
| 2017-08-21 | 253.69 | 218.29 |
| 2017-08-22 | 253.4 | 218.63 |
| 2017-08-23 | 253.16 | 218.72 |
| 2017-08-24 | 253.89 | 218.49 |
| 2017-08-25 | 253.25 | 217.95 |
| 2017-08-28 | 252.72 | 216.33 |
| 2017-08-29 | 250.53 | 214.09 |
| 2017-08-30 | 251.35 | 215.45 |
| 2017-08-31 | 252.25 | 216.82 |
| 2017-09-01 | 253.77 | 217.79 |
| 2017-09-04 | 254.04 | 218.11 |
| 2017-09-05 | 255.62 | 218.45 |
| 2017-09-06 | 257.17 | 219.26 |
| 2017-09-07 | 257.72 | 220.22 |
| 2017-09-08 | 259.03 | 221.13 |
| 2017-09-11 | 259.49 | 222.28 |
| 2017-09-12 | 257.43 | 221.73 |
| 2017-09-13 | 259.03 | 222.1 |
| 2017-09-14 | 258.54 | 222.27 |
| 2017-09-15 | 258.16 | 221.35 |
| 2017-09-18 | 259.41 | 222.01 |
| 2017-09-19 | 259.67 | 222.33 |
| 2017-09-20 | 257.5 | 222.46 |
| 2017-09-21 | 258.2 | 223.36 |
| 2017-09-22 | 258.34 | 224.02 |
| 2017-09-25 | 257.4 | 223.77 |
| 2017-09-26 | 257.11 | 223.68 |
| 2017-09-27 | 257.9 | 224.41 |
| 2017-09-28 | 258.79 | 225.29 |
| 2017-09-29 | 260.82 | 226.56 |
| 2017-10-02 | 261.8 | 227.26 |
| 2017-10-03 | 263.88 | 228.17 |
| 2017-10-04 | 265.46 | 229.29 |
| 2017-10-05 | 265.76 | 229.69 |
| 2017-10-06 | 265.24 | 229.76 |
| 2017-10-09 | 264.64 | 230.31 |
| 2017-10-10 | 264.4 | 230.14 |
| 2017-10-11 | 264.9 | 230.41 |
| 2017-10-12 | 264.86 | 230.54 |
| 2017-10-13 | 264.68 | 230.48 |
| 2017-10-16 | 263.44 | 231.01 |
| 2017-10-17 | 264.26 | 232.03 |
| 2017-10-18 | 263.26 | 231.54 |
| 2017-10-19 | 260.46 | 228.64 |
| 2017-10-20 | 261.61 | 229.15 |
| 2017-10-23 | 260.22 | 228.53 |
| 2017-10-24 | 260.58 | 228.78 |
| 2017-10-25 | 260.93 | 226.5 |
| 2017-10-26 | 260.7 | 226.4 |
| 2017-10-27 | 259.76 | 227.88 |
| 2017-10-30 | 258.39 | 228.83 |
| 2017-10-31 | 258.33 | 228.89 |
| 2017-11-02 | 259.3 | 229.85 |
| 2017-11-03 | 259.24 | 229.64 |
| 2017-11-06 | 259.15 | 229.94 |
| 2017-11-07 | 258.15 | 229.16 |
| 2017-11-08 | 257.45 | 228.75 |
| 2017-11-09 | 254.92 | 225.97 |
| 2017-11-10 | 252.55 | 224.03 |
| 2017-11-13 | 249.29 | 221.25 |
| 2017-11-14 | 250 | 220.76 |
| 2017-11-15 | 245.54 | 217.49 |
| 2017-11-16 | 246.49 | 218.78 |
| 2017-11-17 | 245.97 | 218.74 |
| 2017-11-20 | 247.36 | 219.29 |
| 2017-11-21 | 248.94 | 221.65 |
| 2017-11-22 | 251.14 | 222.88 |
| 2017-11-23 | 250.94 | 222.52 |
| 2017-11-24 | 249.52 | 222.76 |
| 2017-11-27 | 249.2 | 222.28 |
| 2017-11-28 | 250.6 | 223.31 |
| 2017-11-29 | 251.05 | 223.67 |
| 2017-11-30 | 250.82 | 223.98 |
| 2017-12-01 | 249.5 | 222.61 |
| 2017-12-04 | 250.53 | 223.46 |
| 2017-12-05 | 249.19 | 222.33 |
| 2017-12-06 | 247.12 | 221.31 |
| 2017-12-07 | 250.2 | 222.42 |
| 2017-12-08 | 253.52 | 222.86 |
| 2017-12-11 | 255.25 | 223.79 |
| 2017-12-12 | 256.92 | 224.49 |
| 2017-12-13 | 257.36 | 225.34 |
| 2017-12-14 | 256.76 | 225.48 |
| 2017-12-15 | 257.97 | 225.32 |
| 2017-12-18 | 259.75 | 227.49 |
| 2017-12-19 | 259.37 | 227.59 |
| 2017-12-20 | 258.38 | 226.97 |
| 2017-12-21 | 259.51 | 227.56 |
| 2017-12-22 | 257.14 | 227.17 |
| 2017-12-27 | 256.45 | 227.65 |
| 2017-12-28 | 258.41 | 229.09 |
| 2017-12-29 | 259.2 | 229.83 |
| 2018-01-02 | 263.03 | 231 |
| 2018-01-03 | 264.86 | 233.26 |
| 2018-01-04 | 265.72 | 235.27 |
| 2018-01-05 | 266.79 | 237.45 |
| 2018-01-08 | 268.91 | 240.13 |
| 2018-01-09 | 270.09 | 240.86 |
| 2018-01-10 | 270.84 | 240.45 |
| 2018-01-11 | 270.29 | 240.26 |
| 2018-01-12 | 271.78 | 241.42 |
| 2018-01-15 | 274.3 | 241.24 |
| 2018-01-16 | 274.47 | 241.85 |
| 2018-01-17 | 275.12 | 241.51 |
| 2018-01-18 | 274.4 | 241.96 |
| 2018-01-19 | 274.66 | 242.38 |
| 2018-01-22 | 274.64 | 243.42 |
| 2018-01-23 | 276.09 | 243.51 |
| 2018-01-24 | 277.2 | 243.22 |
| 2018-01-25 | 275.28 | 242.11 |
| 2018-01-26 | 274.41 | 242.01 |
| 2018-01-29 | 273.75 | 242.78 |
| 2018-01-30 | 271.44 | 240.34 |
| 2018-01-31 | 270.13 | 240.63 |
| 2018-02-01 | 271.21 | 241.15 |
| 2018-02-02 | 268.72 | 238.18 |
| 2018-02-05 | 263.31 | 233.74 |
| 2018-02-06 | 257.56 | 227.05 |
| 2018-02-07 | 262.94 | 232.9 |
| 2018-02-08 | 260.59 | 229.36 |
| 2018-02-09 | 256.56 | 226.03 |
| 2018-02-12 | 259.94 | 228.72 |
| 2018-02-13 | 258.36 | 227.93 |
| 2018-02-14 | 263.07 | 231.62 |
| 2018-02-15 | 264.14 | 233.65 |
| 2018-02-16 | 266.45 | 235.45 |
| 2018-02-19 | 266.35 | 234.43 |
| 2018-02-20 | 268.16 | 234.7 |
| 2018-02-21 | 266.8 | 234.73 |
| 2018-02-22 | 266.66 | 233.56 |
| 2018-02-23 | 267.28 | 233.69 |
| 2018-02-26 | 265.87 | 235.19 |
| 2018-02-27 | 268.27 | 235.15 |
| 2018-02-28 | 265.91 | 233.88 |